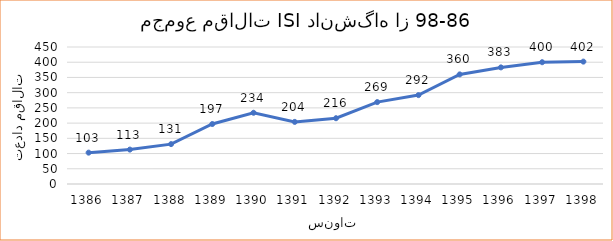
| Category | مجموع مقالات دانشگاه |
|---|---|
| 1386.0 | 103 |
| 1387.0 | 113 |
| 1388.0 | 131 |
| 1389.0 | 197 |
| 1390.0 | 234 |
| 1391.0 | 204 |
| 1392.0 | 216 |
| 1393.0 | 269 |
| 1394.0 | 292 |
| 1395.0 | 360 |
| 1396.0 | 383 |
| 1397.0 | 400 |
| 1398.0 | 402 |